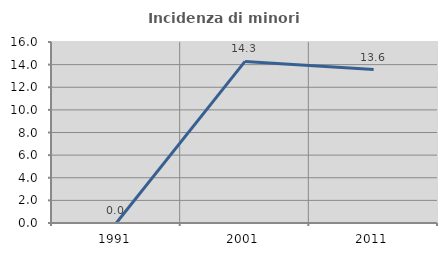
| Category | Incidenza di minori stranieri |
|---|---|
| 1991.0 | 0 |
| 2001.0 | 14.286 |
| 2011.0 | 13.559 |